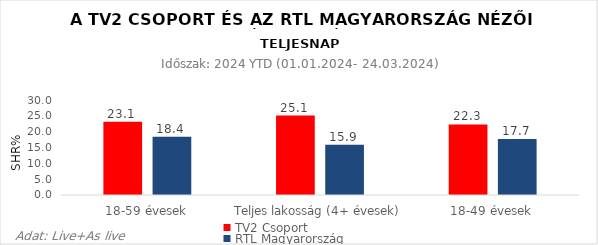
| Category | TV2 Csoport | RTL Magyarország |
|---|---|---|
| 18-59 évesek | 23.1 | 18.4 |
| Teljes lakosság (4+ évesek) | 25.1 | 15.9 |
| 18-49 évesek | 22.3 | 17.7 |